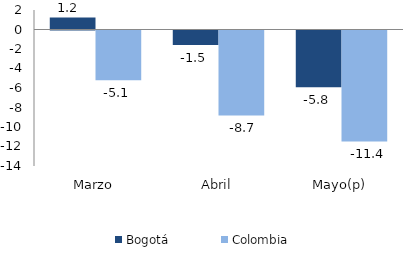
| Category | Bogotá | Colombia |
|---|---|---|
| Marzo | 1.242 | -5.093 |
| Abril | -1.487 | -8.715 |
| Mayo(p) | -5.825 | -11.383 |